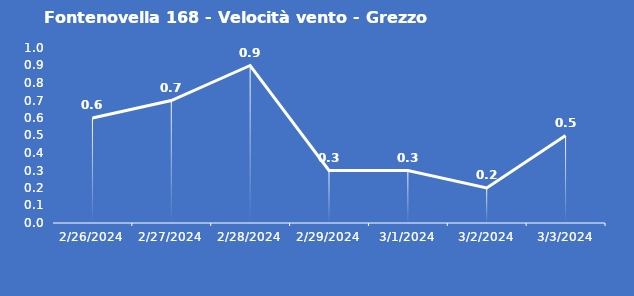
| Category | Fontenovella 168 - Velocità vento - Grezzo (m/s) |
|---|---|
| 2/26/24 | 0.6 |
| 2/27/24 | 0.7 |
| 2/28/24 | 0.9 |
| 2/29/24 | 0.3 |
| 3/1/24 | 0.3 |
| 3/2/24 | 0.2 |
| 3/3/24 | 0.5 |